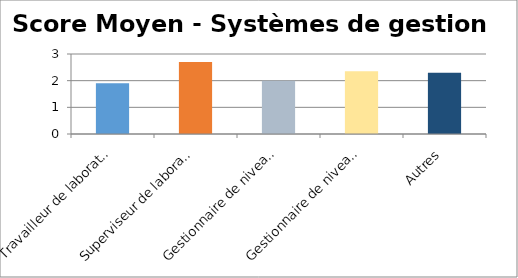
| Category | Score Moyen pour Systèmes de gestion |
|---|---|
| Travailleur de laboratoire | 1.9 |
| Superviseur de laboratoire | 2.7 |
| Gestionnaire de niveau intermédiaire | 2 |
| Gestionnaire de niveausupérieur | 2.35 |
| Autres | 2.3 |